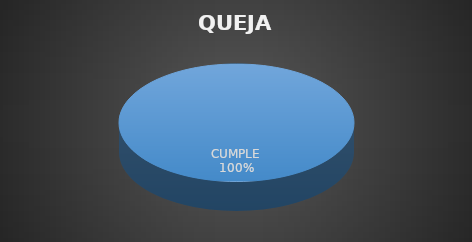
| Category | Series 0 |
|---|---|
| CUMPLE | 2 |